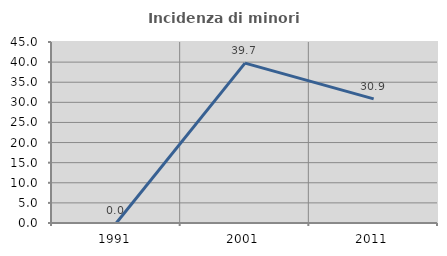
| Category | Incidenza di minori stranieri |
|---|---|
| 1991.0 | 0 |
| 2001.0 | 39.744 |
| 2011.0 | 30.864 |